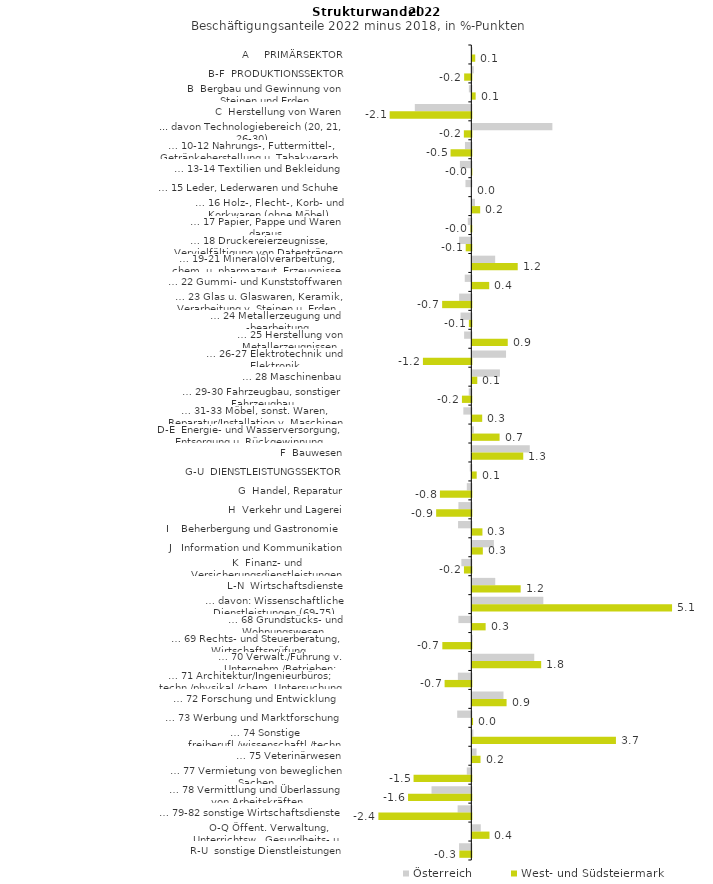
| Category | Österreich | West- und Südsteiermark |
|---|---|---|
| A     PRIMÄRSEKTOR | 0.004 | 0.074 |
| B-F  PRODUKTIONSSEKTOR | 0.036 | -0.184 |
| B  Bergbau und Gewinnung von Steinen und Erden | -0.063 | 0.085 |
| C  Herstellung von Waren | -1.445 | -2.088 |
| ... davon Technologiebereich (20, 21, 26-30) | 2.047 | -0.191 |
| … 10-12 Nahrungs-, Futtermittel-, Getränkeherstellung u. Tabakverarb. | -0.163 | -0.531 |
| … 13-14 Textilien und Bekleidung | -0.292 | -0.008 |
| … 15 Leder, Lederwaren und Schuhe | -0.15 | 0 |
| … 16 Holz-, Flecht-, Korb- und Korkwaren (ohne Möbel)  | 0.068 | 0.2 |
| … 17 Papier, Pappe und Waren daraus  | -0.09 | -0.023 |
| … 18 Druckereierzeugnisse, Vervielfältigung von Datenträgern | -0.314 | -0.144 |
| … 19-21 Mineralölverarbeitung, chem. u. pharmazeut. Erzeugnisse | 0.584 | 1.161 |
| … 22 Gummi- und Kunststoffwaren | -0.168 | 0.431 |
| … 23 Glas u. Glaswaren, Keramik, Verarbeitung v. Steinen u. Erden  | -0.312 | -0.746 |
| … 24 Metallerzeugung und -bearbeitung | -0.276 | -0.063 |
| … 25 Herstellung von Metallerzeugnissen  | -0.185 | 0.906 |
| … 26-27 Elektrotechnik und Elektronik | 0.862 | -1.238 |
| … 28 Maschinenbau | 0.705 | 0.127 |
| … 29-30 Fahrzeugbau, sonstiger Fahrzeugbau | -0.066 | -0.241 |
| … 31-33 Möbel, sonst. Waren, Reparatur/Installation v. Maschinen | -0.204 | 0.252 |
| D-E  Energie- und Wasserversorgung, Entsorgung u. Rückgewinnung | 0.038 | 0.697 |
| F  Bauwesen | 1.469 | 1.302 |
| G-U  DIENSTLEISTUNGSSEKTOR | -0.04 | 0.112 |
| G  Handel, Reparatur | -0.115 | -0.803 |
| H  Verkehr und Lagerei | -0.33 | -0.9 |
| I    Beherbergung und Gastronomie | -0.34 | 0.259 |
| J   Information und Kommunikation | 0.551 | 0.269 |
| K  Finanz- und Versicherungsdienstleistungen | -0.255 | -0.189 |
| L-N  Wirtschaftsdienste | 0.586 | 1.236 |
| … davon: Wissenschaftliche Dienstleistungen (69-75) | 1.815 | 5.107 |
| … 68 Grundstücks- und Wohnungswesen  | -0.331 | 0.34 |
| … 69 Rechts- und Steuerberatung, Wirtschaftsprüfung | 0.008 | -0.742 |
| … 70 Verwalt./Führung v. Unternehm./Betrieben; Unternehmensberat. | 1.583 | 1.76 |
| … 71 Architektur/Ingenieurbüros; techn./physikal./chem. Untersuchung | -0.344 | -0.684 |
| … 72 Forschung und Entwicklung  | 0.797 | 0.876 |
| … 73 Werbung und Marktforschung | -0.361 | 0.019 |
| … 74 Sonstige freiberufl./wissenschaftl./techn. Tätigkeiten | 0.025 | 3.672 |
| … 75 Veterinärwesen | 0.108 | 0.209 |
| … 77 Vermietung von beweglichen Sachen  | -0.116 | -1.477 |
| … 78 Vermittlung und Überlassung von Arbeitskräften | -1.018 | -1.618 |
| … 79-82 sonstige Wirtschaftsdienste | -0.351 | -2.376 |
| O-Q Öffent. Verwaltung, Unterrichtsw., Gesundheits- u. Sozialwesen | 0.216 | 0.438 |
| R-U  sonstige Dienstleistungen | -0.314 | -0.306 |